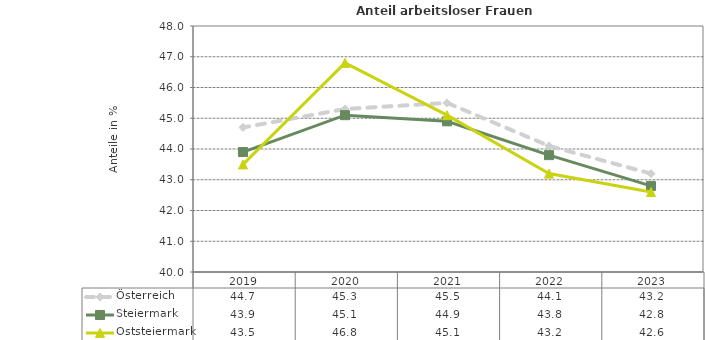
| Category | Österreich | Steiermark | Oststeiermark |
|---|---|---|---|
| 2023.0 | 43.2 | 42.8 | 42.6 |
| 2022.0 | 44.1 | 43.8 | 43.2 |
| 2021.0 | 45.5 | 44.9 | 45.1 |
| 2020.0 | 45.3 | 45.1 | 46.8 |
| 2019.0 | 44.7 | 43.9 | 43.5 |